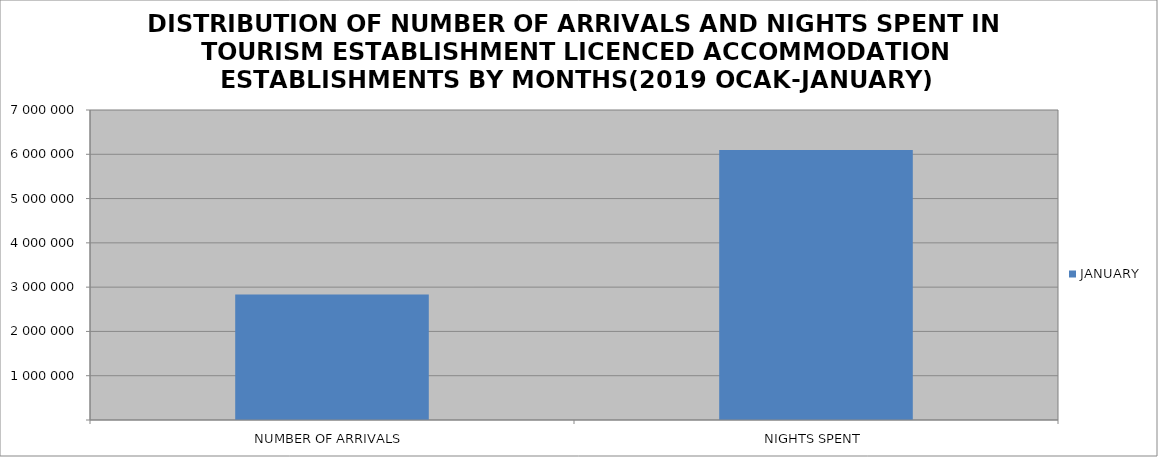
| Category | JANUARY |
|---|---|
| NUMBER OF ARRIVALS | 2833509 |
| NIGHTS SPENT | 6098050 |